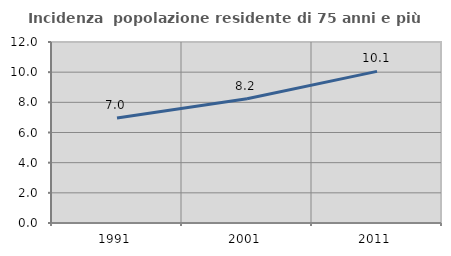
| Category | Incidenza  popolazione residente di 75 anni e più |
|---|---|
| 1991.0 | 6.954 |
| 2001.0 | 8.235 |
| 2011.0 | 10.052 |